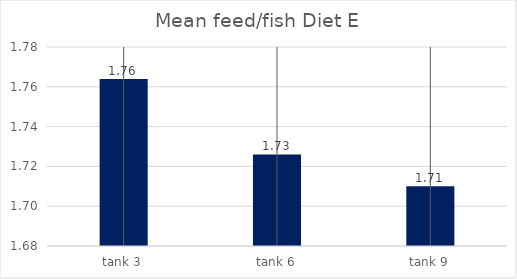
| Category | Diet E |
|---|---|
| tank 3 | 1.764 |
| tank 6 | 1.726 |
| tank 9 | 1.71 |